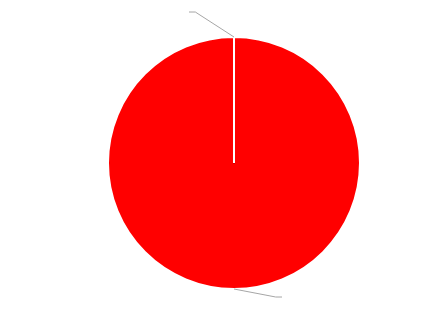
| Category | Fiscalizações |
|---|---|
| 0.0 | 0 |
| 28.0 | 28 |